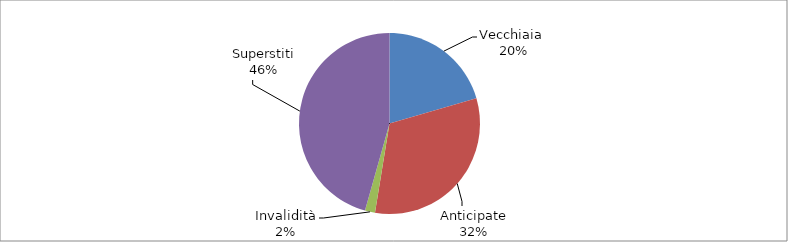
| Category | Series 0 |
|---|---|
| Vecchiaia  | 2022 |
| Anticipate | 3161 |
| Invalidità | 177 |
| Superstiti | 4499 |